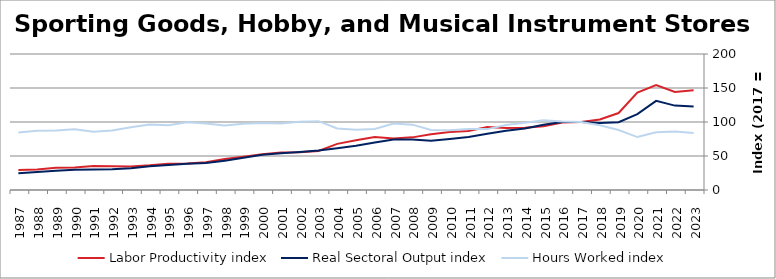
| Category | Labor Productivity index | Real Sectoral Output index | Hours Worked index |
|---|---|---|---|
| 2023.0 | 146.562 | 122.89 | 83.849 |
| 2022.0 | 144.288 | 124.098 | 86.007 |
| 2021.0 | 154.183 | 131.046 | 84.993 |
| 2020.0 | 143.372 | 111.582 | 77.827 |
| 2019.0 | 113.198 | 99.781 | 88.147 |
| 2018.0 | 103.577 | 98.472 | 95.072 |
| 2017.0 | 100 | 100 | 100 |
| 2016.0 | 99.261 | 99.932 | 100.676 |
| 2015.0 | 93.744 | 96.108 | 102.522 |
| 2014.0 | 91.675 | 90.573 | 98.798 |
| 2013.0 | 91.16 | 87.164 | 95.616 |
| 2012.0 | 92.464 | 82.798 | 89.546 |
| 2011.0 | 86.851 | 77.897 | 89.69 |
| 2010.0 | 85.396 | 74.956 | 87.775 |
| 2009.0 | 82.038 | 72.481 | 88.35 |
| 2008.0 | 77.401 | 74.406 | 96.129 |
| 2007.0 | 75.921 | 74.167 | 97.69 |
| 2006.0 | 77.89 | 69.848 | 89.675 |
| 2005.0 | 73.245 | 64.957 | 88.684 |
| 2004.0 | 67.857 | 61.416 | 90.509 |
| 2003.0 | 57.392 | 58.102 | 101.237 |
| 2002.0 | 55.636 | 55.837 | 100.362 |
| 2001.0 | 55.035 | 53.883 | 97.906 |
| 2000.0 | 52.619 | 51.83 | 98.501 |
| 1999.0 | 48.815 | 47.525 | 97.357 |
| 1998.0 | 45.436 | 43.075 | 94.804 |
| 1997.0 | 40.796 | 39.87 | 97.731 |
| 1996.0 | 38.885 | 38.705 | 99.537 |
| 1995.0 | 38.568 | 36.679 | 95.102 |
| 1994.0 | 36.316 | 35.029 | 96.456 |
| 1993.0 | 34.71 | 32.029 | 92.277 |
| 1992.0 | 34.771 | 30.399 | 87.424 |
| 1991.0 | 35.348 | 30.24 | 85.548 |
| 1990.0 | 33.15 | 29.605 | 89.305 |
| 1989.0 | 32.617 | 28.484 | 87.33 |
| 1988.0 | 30.286 | 26.389 | 87.134 |
| 1987.0 | 29.276 | 24.764 | 84.591 |